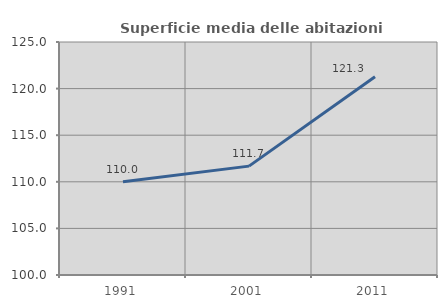
| Category | Superficie media delle abitazioni occupate |
|---|---|
| 1991.0 | 109.997 |
| 2001.0 | 111.681 |
| 2011.0 | 121.266 |